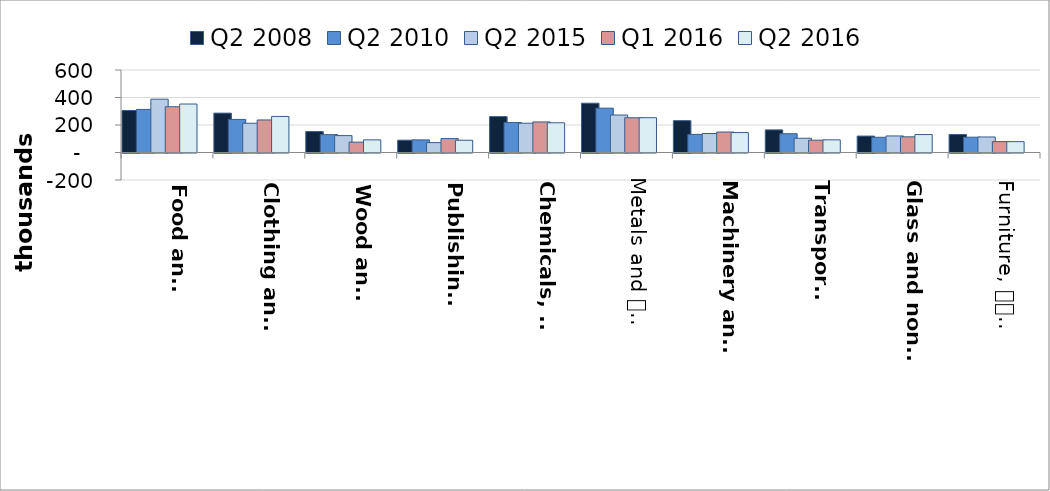
| Category | Q2 2008 | Q2 2010 | Q2 2015 | Q1 2016 | Q2 2016 | Series 6 |
|---|---|---|---|---|---|---|
| Food and 
beverages | 305.594 | 313.369 | 387.793 | 332.836 | 352.595 | 19.759 |
| Clothing and 
footwear | 286.298 | 240.475 | 212.895 | 236.792 | 262.36 | 25.568 |
| Wood and 
paper | 152.247 | 129.828 | 122.901 | 75.141 | 91.904 | 16.763 |
| Publishing 
and printing | 89.511 | 91.817 | 71.872 | 101.171 | 89.123 | -12.048 |
| Chemicals, 
rubber, plastic | 260.969 | 217.861 | 213.11 | 222.371 | 216.072 | -6.299 |
| Metals and 
metal products | 358.367 | 322.434 | 272.563 | 252.724 | 252.966 | 0.241 |
| Machinery and 
equipment | 231.621 | 131.903 | 138.016 | 148.843 | 144.964 | -3.88 |
| Transport 
equipment | 164.405 | 136.701 | 103.644 | 89.746 | 92.002 | 2.256 |
| Glass and non-
metallic minerals | 119.47 | 110.702 | 120.372 | 114.11 | 130.61 | 16.5 |
| Furniture, 
recycling, other | 130.505 | 111.373 | 112.864 | 79.16 | 78.913 | -0.247 |